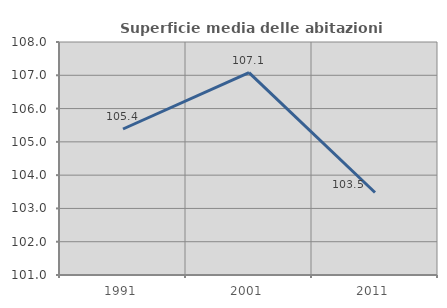
| Category | Superficie media delle abitazioni occupate |
|---|---|
| 1991.0 | 105.386 |
| 2001.0 | 107.08 |
| 2011.0 | 103.479 |